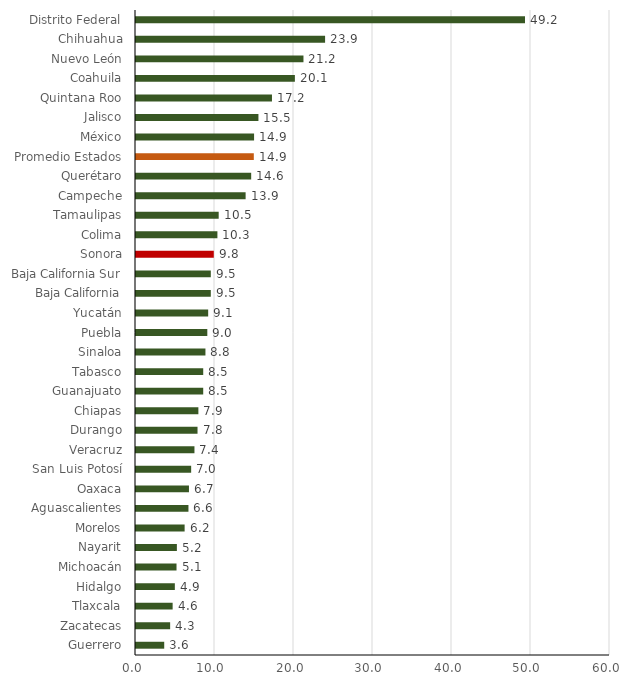
| Category | Proporción Recaudación de Ing. Totales |
|---|---|
| Guerrero | 3.572 |
| Zacatecas | 4.323 |
| Tlaxcala | 4.638 |
| Hidalgo | 4.916 |
| Michoacán | 5.129 |
| Nayarit | 5.174 |
| Morelos | 6.155 |
| Aguascalientes | 6.639 |
| Oaxaca | 6.704 |
| San Luis Potosí | 6.982 |
| Veracruz | 7.399 |
| Durango | 7.788 |
| Chiapas | 7.897 |
| Guanajuato | 8.508 |
| Tabasco | 8.509 |
| Sinaloa | 8.79 |
| Puebla | 9.027 |
| Yucatán | 9.136 |
| Baja California | 9.468 |
| Baja California Sur | 9.469 |
| Sonora | 9.847 |
| Colima | 10.305 |
| Tamaulipas | 10.467 |
| Campeche | 13.876 |
| Querétaro | 14.58 |
| Promedio Estados | 14.913 |
| México | 14.946 |
| Jalisco | 15.498 |
| Quintana Roo | 17.211 |
| Coahuila | 20.112 |
| Nuevo León | 21.198 |
| Chihuahua | 23.936 |
| Distrito Federal | 49.241 |